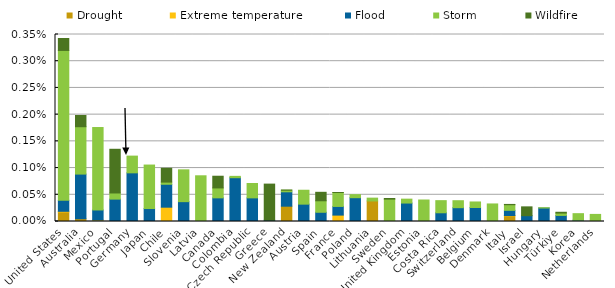
| Category | Drought | Extreme temperature | Flood | Storm | Wildfire |
|---|---|---|---|---|---|
| United States | 0 | 0 | 0 | 0.003 | 0 |
| Australia | 0 | 0 | 0.001 | 0.001 | 0 |
| Mexico | 0 | 0 | 0 | 0.002 | 0 |
| Portugal | 0 | 0 | 0 | 0 | 0.001 |
| Germany | 0 | 0 | 0.001 | 0 | 0 |
| Japan | 0 | 0 | 0 | 0.001 | 0 |
| Chile | 0 | 0 | 0 | 0 | 0 |
| Slovenia | 0 | 0 | 0 | 0.001 | 0 |
| Latvia | 0 | 0 | 0 | 0.001 | 0 |
| Canada | 0 | 0 | 0 | 0 | 0 |
| Colombia | 0 | 0 | 0.001 | 0 | 0 |
| Czech Republic | 0 | 0 | 0 | 0 | 0 |
| Greece | 0 | 0 | 0 | 0 | 0.001 |
| New Zealand | 0 | 0 | 0 | 0 | 0 |
| Austria | 0 | 0 | 0 | 0 | 0 |
| Spain | 0 | 0 | 0 | 0 | 0 |
| France | 0 | 0 | 0 | 0 | 0 |
| Poland | 0 | 0 | 0 | 0 | 0 |
| Lithuania | 0 | 0 | 0 | 0 | 0 |
| Sweden | 0 | 0 | 0 | 0 | 0 |
| United Kingdom | 0 | 0 | 0 | 0 | 0 |
| Estonia | 0 | 0 | 0 | 0 | 0 |
| Costa Rica | 0 | 0 | 0 | 0 | 0 |
| Switzerland | 0 | 0 | 0 | 0 | 0 |
| Belgium | 0 | 0 | 0 | 0 | 0 |
| Denmark | 0 | 0 | 0 | 0 | 0 |
| Italy | 0 | 0 | 0 | 0 | 0 |
| Israel | 0 | 0 | 0 | 0 | 0 |
| Hungary | 0 | 0 | 0 | 0 | 0 |
| Türkiye | 0 | 0 | 0 | 0 | 0 |
| Korea | 0 | 0 | 0 | 0 | 0 |
| Netherlands | 0 | 0 | 0 | 0 | 0 |